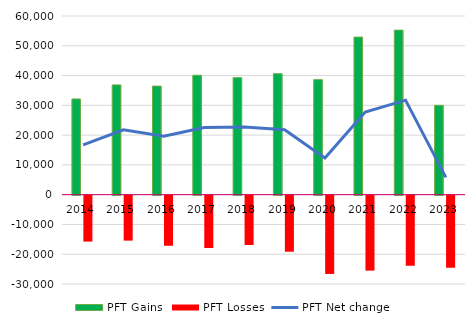
| Category | PFT Gains  | PFT Losses |
|---|---|---|
| 2014.0 | 32152 | -15421 |
| 2015.0 | 36868 | -15094 |
| 2016.0 | 36451 | -16826 |
| 2017.0 | 40111 | -17570 |
| 2018.0 | 39292 | -16576 |
| 2019.0 | 40632 | -18817 |
| 2020.0 | 38627 | -26288 |
| 2021.0 | 52908 | -25167 |
| 2022.0 | 55260 | -23528 |
| 2023.0 | 30004 | -24198 |